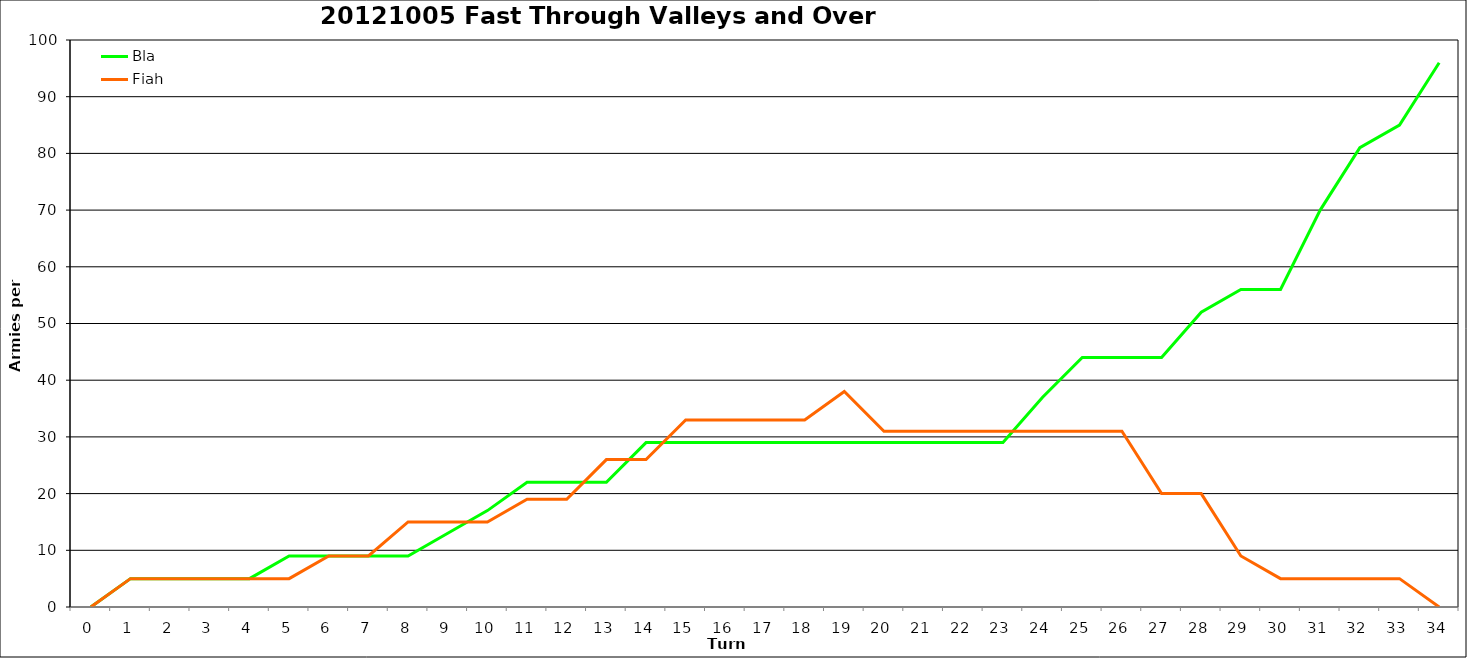
| Category | Bla | Fiah |
|---|---|---|
| 0.0 | 0 | 0 |
| 1.0 | 5 | 5 |
| 2.0 | 5 | 5 |
| 3.0 | 5 | 5 |
| 4.0 | 5 | 5 |
| 5.0 | 9 | 5 |
| 6.0 | 9 | 9 |
| 7.0 | 9 | 9 |
| 8.0 | 9 | 15 |
| 9.0 | 13 | 15 |
| 10.0 | 17 | 15 |
| 11.0 | 22 | 19 |
| 12.0 | 22 | 19 |
| 13.0 | 22 | 26 |
| 14.0 | 29 | 26 |
| 15.0 | 29 | 33 |
| 16.0 | 29 | 33 |
| 17.0 | 29 | 33 |
| 18.0 | 29 | 33 |
| 19.0 | 29 | 38 |
| 20.0 | 29 | 31 |
| 21.0 | 29 | 31 |
| 22.0 | 29 | 31 |
| 23.0 | 29 | 31 |
| 24.0 | 37 | 31 |
| 25.0 | 44 | 31 |
| 26.0 | 44 | 31 |
| 27.0 | 44 | 20 |
| 28.0 | 52 | 20 |
| 29.0 | 56 | 9 |
| 30.0 | 56 | 5 |
| 31.0 | 70 | 5 |
| 32.0 | 81 | 5 |
| 33.0 | 85 | 5 |
| 34.0 | 96 | 0 |